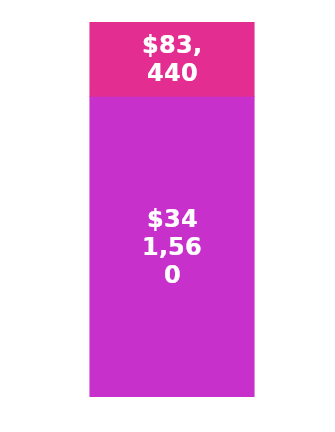
| Category | Balance | Total Startup Costs |
|---|---|---|
| 0 | 341560 | 83440 |